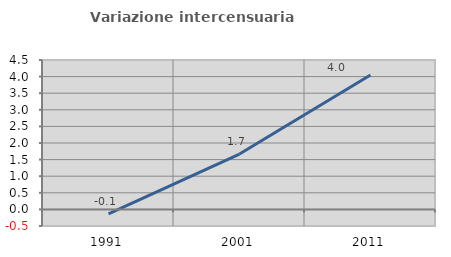
| Category | Variazione intercensuaria annua |
|---|---|
| 1991.0 | -0.135 |
| 2001.0 | 1.668 |
| 2011.0 | 4.048 |